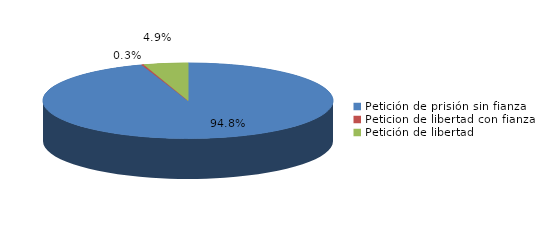
| Category | Series 0 |
|---|---|
| Petición de prisión sin fianza | 2210 |
| Peticion de libertad con fianza | 6 |
| Petición de libertad | 115 |